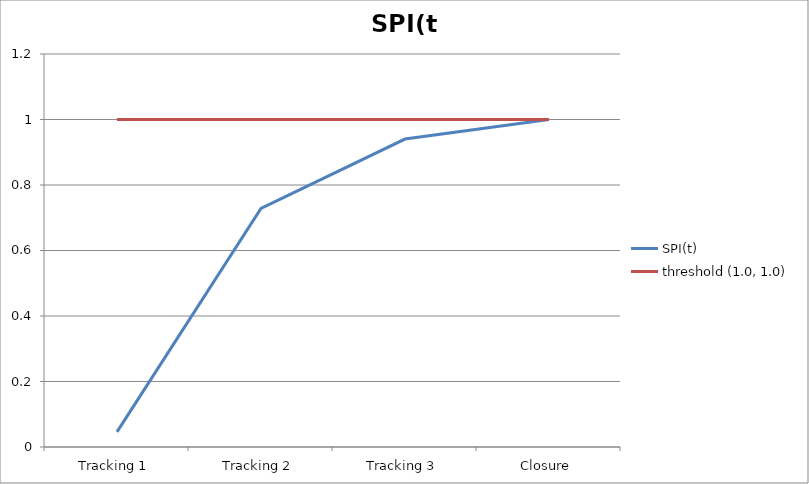
| Category | SPI(t) | threshold (1.0, 1.0) |
|---|---|---|
| Tracking 1 | 0.046 | 1 |
| Tracking 2 | 0.728 | 1 |
| Tracking 3 | 0.94 | 1 |
| Closure | 1 | 1 |